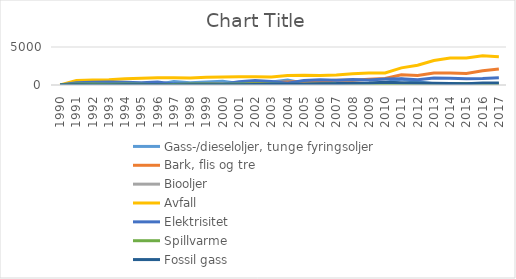
| Category | Gass-/dieseloljer, tunge fyringsoljer | Bark, flis og tre | Biooljer | Avfall | Elektrisitet | Spillvarme | Fossil gass |
|---|---|---|---|---|---|---|---|
| 1990.0 | 0 | 0 | 0 | 0 | 0 | 0 | 2.8 |
| 1991.0 | 21.1 | 28.5 | 0 | 582.5 | 303.9 | 146.1 | 18.6 |
| 1992.0 | 52 | 40.4 | 0 | 662.8 | 365.4 | 133.6 | 13.2 |
| 1993.0 | 17.9 | 52.3 | 0 | 695.1 | 383.2 | 110.6 | 13.7 |
| 1994.0 | 5.9 | 52.6 | 0 | 808.6 | 360.7 | 116.5 | 21.5 |
| 1995.0 | 113.1 | 39.4 | 0 | 894.9 | 284.5 | 108.9 | 28.6 |
| 1996.0 | 77.1 | 53.6 | 0 | 964.4 | 383.9 | 41.6 | 18.1 |
| 1997.0 | 466 | 72.7 | 0 | 953.7 | 148.1 | 78.6 | 6.2 |
| 1998.0 | 309.4 | 74.6 | 0 | 923.3 | 166.4 | 138.1 | 18.9 |
| 1999.0 | 397.9 | 119.5 | 0 | 1006.2 | 159.4 | 142.5 | 33 |
| 2000.0 | 489.1 | 98.7 | 0 | 1065.6 | 105 | 114.5 | 33.6 |
| 2001.0 | 188.9 | 111.8 | 0 | 1079.8 | 420.4 | 129.7 | 35.1 |
| 2002.0 | 217.9 | 259.7 | 0 | 1097.7 | 586 | 151.8 | 55.4 |
| 2003.0 | 398.8 | 338.2 | 0 | 1058.3 | 466.4 | 122.9 | 112 |
| 2004.0 | 647.2 | 390.5 | 0 | 1254.5 | 237.3 | 63.4 | 83.4 |
| 2005.0 | 244.2 | 484.9 | 0 | 1285.5 | 604.7 | 86 | 101.6 |
| 2006.0 | 150.7 | 532 | 0 | 1246 | 700.1 | 119.2 | 179.2 |
| 2007.0 | 224.2 | 613.2 | 0 | 1314 | 617.7 | 149.2 | 184.6 |
| 2008.0 | 237.5 | 630.1 | 0 | 1483.5 | 733.1 | 190.8 | 244.3 |
| 2009.0 | 165.1 | 751.6 | 0 | 1582 | 671.8 | 151.5 | 264.8 |
| 2010.0 | 305.9 | 847.2 | 0 | 1574.2 | 798.9 | 173.7 | 346.1 |
| 2011.0 | 780.2 | 1358.5 | 0 | 2251 | 837.6 | 198.2 | 283.7 |
| 2012.0 | 424 | 1265.6 | 0 | 2605.1 | 692.3 | 157.2 | 250.2 |
| 2013.0 | 181.7 | 1591.2 | 0 | 3223.4 | 927.8 | 202.5 | 227.1 |
| 2014.0 | 159.9 | 1573.4 | 79 | 3559.3 | 884.3 | 206.4 | 190.1 |
| 2015.0 | 93.1 | 1522 | 38 | 3554.4 | 823.6 | 200.7 | 177.2 |
| 2016.0 | 87.1 | 1879.6 | 35.2 | 3835.9 | 842.4 | 181.1 | 251.3 |
| 2017.0 | 101.1 | 2104.1 | 56.5 | 3724.6 | 965 | 184 | 255.7 |